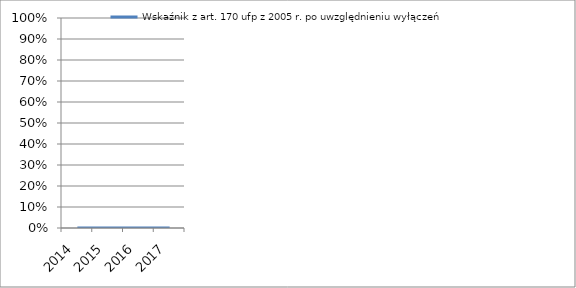
| Category | Wskaźnik z art. 170 ufp z 2005 r. po uwzględnieniu wyłączeń |
|---|---|
| 2014.0 | 0 |
| 2015.0 | 0 |
| 2016.0 | 0 |
| 2017.0 | 0 |